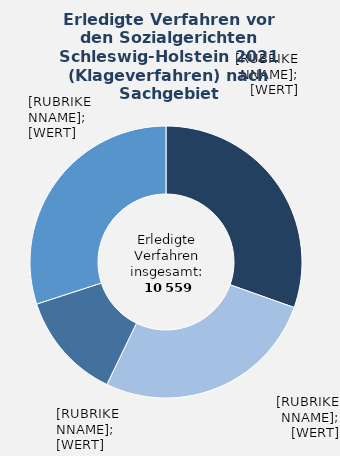
| Category | in Prozent |
|---|---|
| Krankenversicherung | 0.304 |
| Angelegenheiten nach dem SGB II | 0.267 |
| Rentenversicherung | 0.128 |
| Übrige Sachgebiete¹  | 0.3 |